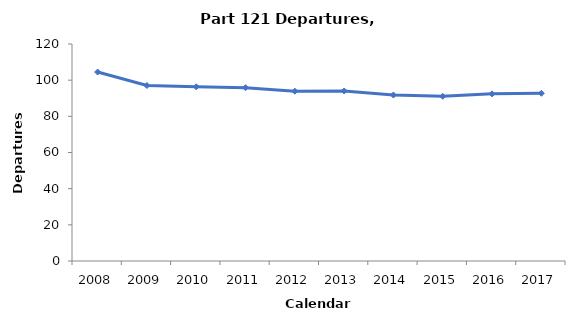
| Category | Departures (100,000s) |
|---|---|
| 2008.0 | 104.481 |
| 2009.0 | 97.051 |
| 2010.0 | 96.338 |
| 2011.0 | 95.839 |
| 2012.0 | 93.907 |
| 2013.0 | 94.019 |
| 2014.0 | 91.787 |
| 2015.0 | 91.072 |
| 2016.0 | 92.43 |
| 2017.0 | 92.742 |